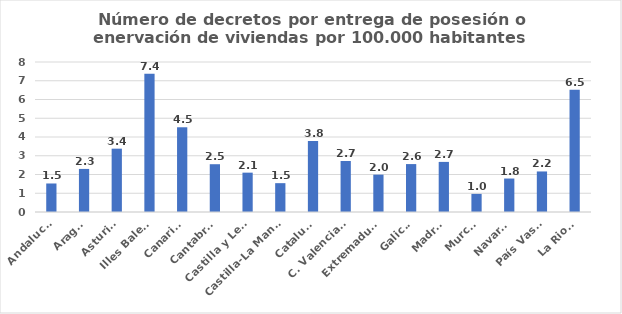
| Category | Numero de decretos por entrega de posesión o enervacion por 100.000 habitantes |
|---|---|
| Andalucía | 1.521 |
| Aragón | 2.297 |
| Asturias | 3.378 |
| Illes Balears | 7.375 |
| Canarias | 4.519 |
| Cantabria | 2.549 |
| Castilla y León | 2.099 |
| Castilla-La Mancha | 1.538 |
| Cataluña | 3.785 |
| C. Valenciana | 2.721 |
| Extremadura | 1.992 |
| Galicia | 2.556 |
| Madrid | 2.672 |
| Murcia | 0.966 |
| Navarra | 1.785 |
| País Vasco | 2.162 |
| La Rioja | 6.516 |